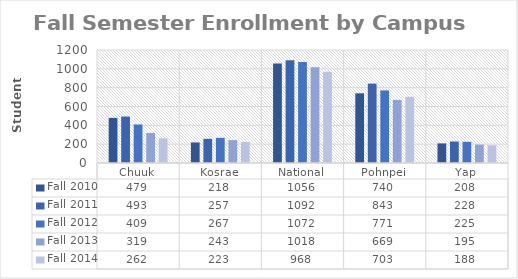
| Category | Fall 2010 | Fall 2011 | Fall 2012 | Fall 2013 | Fall 2014 |
|---|---|---|---|---|---|
| Chuuk | 479 | 493 | 409 | 319 | 262 |
| Kosrae | 218 | 257 | 267 | 243 | 223 |
| National | 1056 | 1092 | 1072 | 1018 | 968 |
| Pohnpei | 740 | 843 | 771 | 669 | 703 |
| Yap | 208 | 228 | 225 | 195 | 188 |